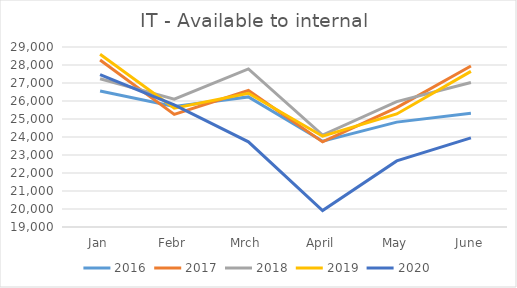
| Category | 2016 | 2017 | 2018 | 2019 | 2020 |
|---|---|---|---|---|---|
| Jan | 26559 | 28280 | 27240 | 28599 | 27463 |
| Febr | 25702 | 25256 | 26106 | 25599 | 25782 |
| Mrch | 26228 | 26585 | 27781 | 26427 | 23733 |
| April | 23766 | 23730 | 24108 | 24045 | 19910 |
| May | 24826 | 25636 | 25963 | 25280 | 22673 |
| June | 25314 | 27941 | 27032 | 27647 | 23953 |